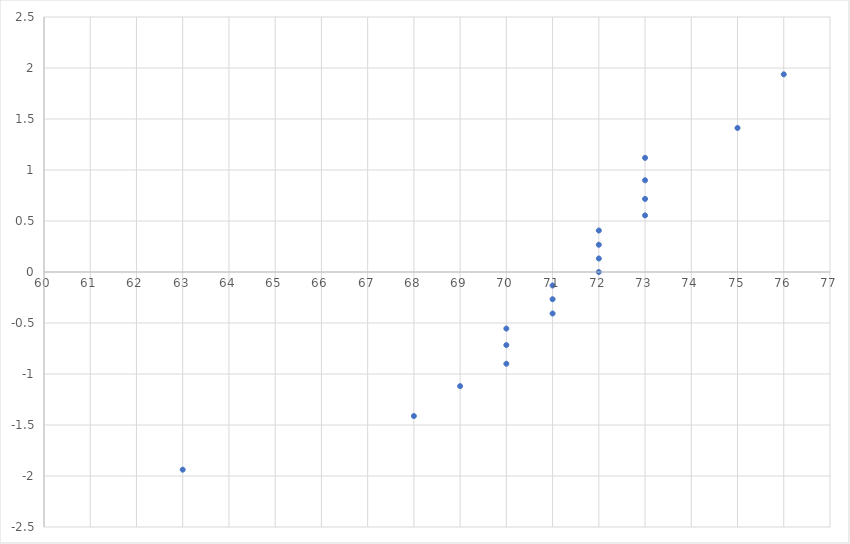
| Category | Series 0 |
|---|---|
| 63.0 | -1.938 |
| 68.0 | -1.412 |
| 69.0 | -1.119 |
| 70.0 | -0.899 |
| 70.0 | -0.716 |
| 70.0 | -0.555 |
| 71.0 | -0.407 |
| 71.0 | -0.267 |
| 71.0 | -0.132 |
| 72.0 | 0 |
| 72.0 | 0.132 |
| 72.0 | 0.267 |
| 72.0 | 0.407 |
| 73.0 | 0.555 |
| 73.0 | 0.716 |
| 73.0 | 0.899 |
| 73.0 | 1.119 |
| 75.0 | 1.412 |
| 76.0 | 1.938 |